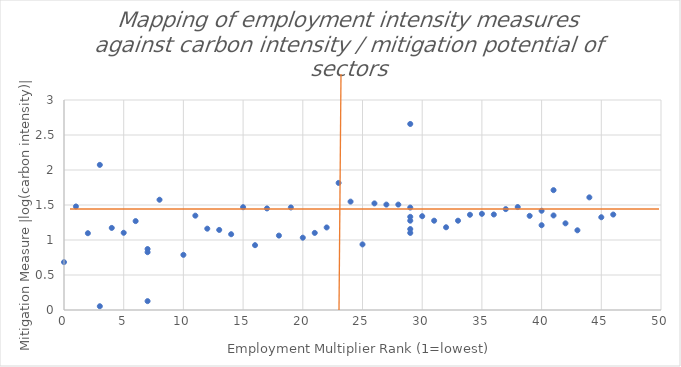
| Category | Series 0 |
|---|---|
| 46.0 | 1.364 |
| 45.0 | 1.325 |
| 44.0 | 1.609 |
| 43.0 | 1.138 |
| 42.0 | 1.238 |
| 41.0 | 1.712 |
| 40.0 | 1.211 |
| 41.0 | 1.351 |
| 40.0 | 1.418 |
| 39.0 | 1.345 |
| 38.0 | 1.471 |
| 37.0 | 1.441 |
| 36.0 | 1.365 |
| 35.0 | 1.374 |
| 34.0 | 1.361 |
| 33.0 | 1.276 |
| 32.0 | 1.182 |
| 31.0 | 1.276 |
| 30.0 | 1.34 |
| 29.0 | 2.658 |
| 29.0 | 1.276 |
| 29.0 | 1.331 |
| 29.0 | 1.101 |
| 29.0 | 1.463 |
| 29.0 | 1.156 |
| 28.0 | 1.506 |
| 27.0 | 1.506 |
| 26.0 | 1.523 |
| 25.0 | 0.937 |
| 24.0 | 1.548 |
| 23.0 | 1.815 |
| 22.0 | 1.179 |
| 21.0 | 1.101 |
| 20.0 | 1.033 |
| 19.0 | 1.465 |
| 18.0 | 1.063 |
| 17.0 | 1.451 |
| 16.0 | 0.926 |
| 15.0 | 1.469 |
| 14.0 | 1.082 |
| 13.0 | 1.144 |
| 12.0 | 1.162 |
| 11.0 | 1.348 |
| 10.0 | 0.788 |
| 7.0 | 0.826 |
| 8.0 | 1.575 |
| 7.0 | 0.871 |
| 6.0 | 1.27 |
| 0.0 | 0.684 |
| 5.0 | 1.103 |
| 7.0 | 0.127 |
| 4.0 | 1.173 |
| 3.0 | 2.073 |
| 3.0 | 0.054 |
| 2.0 | 1.097 |
| 1.0 | 1.479 |